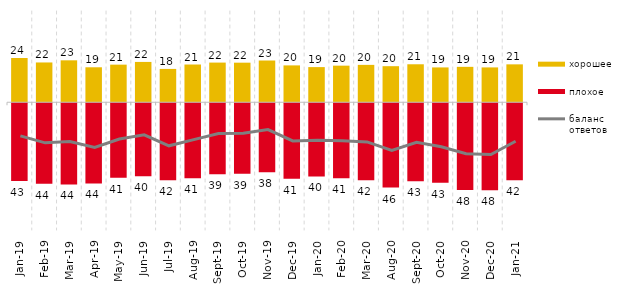
| Category | хорошее | плохое |
|---|---|---|
| 2019-01-01 | 24.25 | -42.65 |
| 2019-02-01 | 21.8 | -44.05 |
| 2019-03-01 | 22.974 | -44.455 |
| 2019-04-01 | 19.158 | -43.96 |
| 2019-05-01 | 20.604 | -40.763 |
| 2019-06-01 | 22.095 | -39.95 |
| 2019-07-01 | 18.267 | -42.129 |
| 2019-08-01 | 20.679 | -41.159 |
| 2019-09-01 | 21.733 | -38.911 |
| 2019-10-01 | 21.683 | -38.614 |
| 2019-11-01 | 22.871 | -37.871 |
| 2019-12-01 | 20.198 | -41.386 |
| 2020-01-01 | 19.257 | -40.099 |
| 2020-02-01 | 20.05 | -41.089 |
| 2020-03-01 | 20.476 | -42.191 |
| 2020-08-01 | 19.762 | -46.177 |
| 2020-09-01 | 20.806 | -42.758 |
| 2020-10-01 | 19.083 | -43.498 |
| 2020-11-01 | 19.4 | -47.6 |
| 2020-12-01 | 19.088 | -47.695 |
| 2021-01-01 | 20.765 | -42.126 |